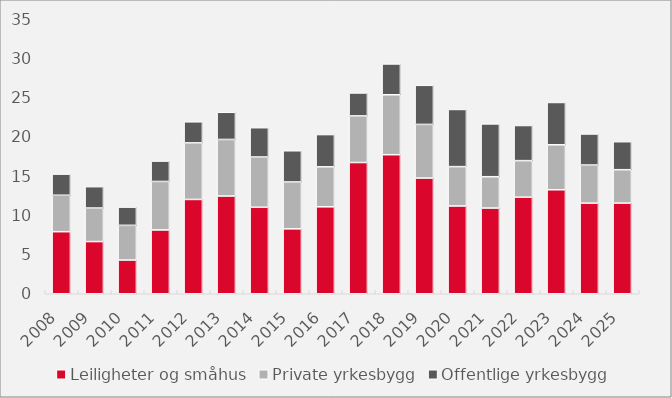
| Category | Leiligheter og småhus | Private yrkesbygg | Offentlige yrkesbygg |
|---|---|---|---|
| 2008.0 | 7.899 | 4.638 | 2.691 |
| 2009.0 | 6.642 | 4.268 | 2.719 |
| 2010.0 | 4.292 | 4.416 | 2.318 |
| 2011.0 | 8.125 | 6.167 | 2.594 |
| 2012.0 | 12.002 | 7.201 | 2.684 |
| 2013.0 | 12.437 | 7.2 | 3.458 |
| 2014.0 | 11.006 | 6.399 | 3.729 |
| 2015.0 | 8.263 | 5.965 | 3.974 |
| 2016.0 | 11.066 | 5.089 | 4.104 |
| 2017.0 | 16.701 | 5.932 | 2.923 |
| 2018.0 | 17.698 | 7.629 | 3.921 |
| 2019.0 | 14.727 | 6.825 | 4.975 |
| 2020.0 | 11.172 | 5.009 | 7.274 |
| 2021.0 | 10.906 | 3.991 | 6.723 |
| 2022.0 | 12.29 | 4.652 | 4.471 |
| 2023.0 | 13.236 | 5.723 | 5.385 |
| 2024.0 | 11.53 | 4.853 | 3.953 |
| 2025.0 | 11.538 | 4.251 | 3.563 |